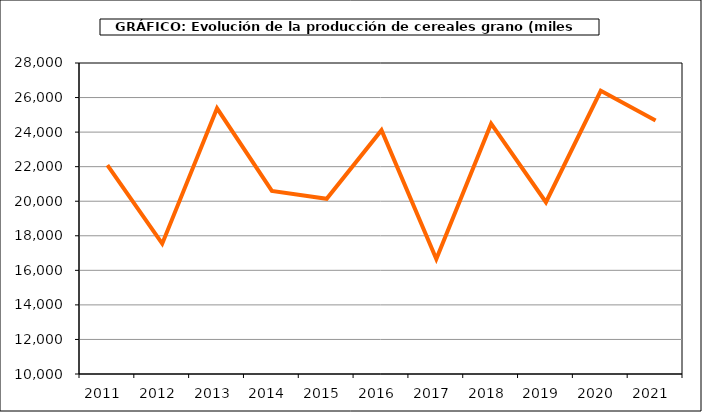
| Category | Produccion |
|---|---|
| 2011.0 | 22094.521 |
| 2012.0 | 17543.823 |
| 2013.0 | 25374.359 |
| 2014.0 | 20596.94 |
| 2015.0 | 20140.943 |
| 2016.0 | 24114.796 |
| 2017.0 | 16658.841 |
| 2018.0 | 24490.855 |
| 2019.0 | 19942.145 |
| 2020.0 | 26389.584 |
| 2021.0 | 24670.075 |